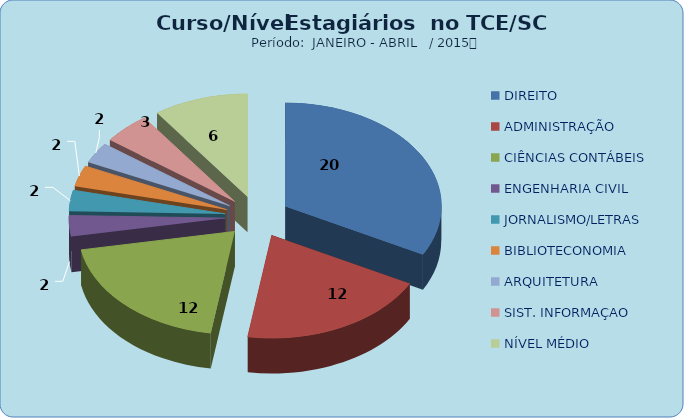
| Category | Series 0 |
|---|---|
| DIREITO | 20 |
| ADMINISTRAÇÃO | 12 |
| CIÊNCIAS CONTÁBEIS | 12 |
| ENGENHARIA CIVIL | 2 |
| JORNALISMO/LETRAS | 2 |
| BIBLIOTECONOMIA | 2 |
| ARQUITETURA | 2 |
| SIST. INFORMAÇAO | 3 |
| NÍVEL MÉDIO | 6 |